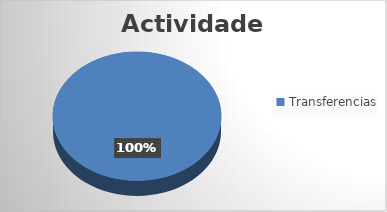
| Category | Transferencias |
|---|---|
| 0 | 7 |